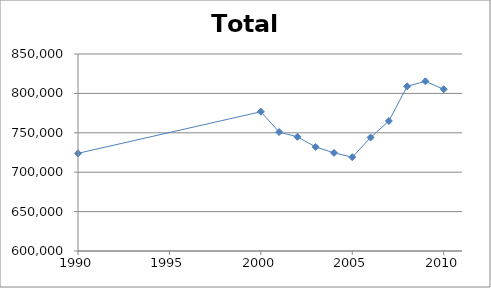
| Category | Series 0 |
|---|---|
| 1990.0 | 723959 |
| 2000.0 | 776733 |
| 2001.0 | 750966 |
| 2002.0 | 744881 |
| 2003.0 | 731978 |
| 2004.0 | 724538 |
| 2005.0 | 719077 |
| 2006.0 | 744041 |
| 2007.0 | 764976 |
| 2008.0 | 808976 |
| 2009.0 | 815358 |
| 2010.0 | 805235 |